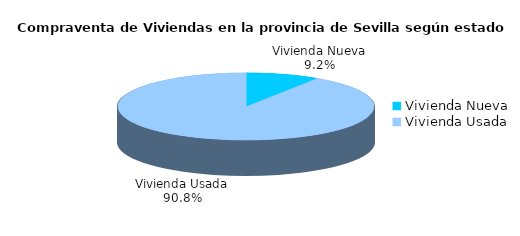
| Category | Series 0 | Series 1 |
|---|---|---|
| Vivienda Nueva | 94 | 0.092 |
| Vivienda Usada | 923 | 0.908 |